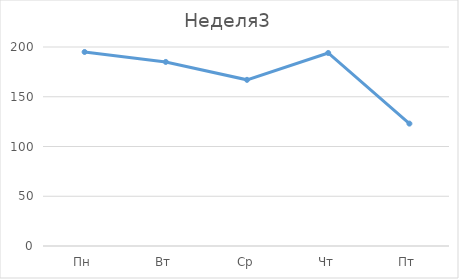
| Category | Неделя3 |
|---|---|
| Пн | 195 |
| Вт | 185 |
| Ср | 167 |
| Чт | 194 |
| Пт | 123 |